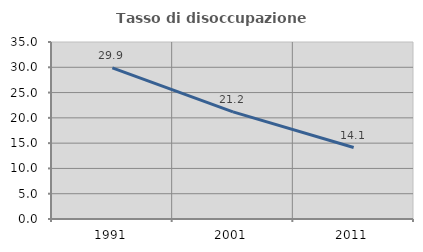
| Category | Tasso di disoccupazione giovanile  |
|---|---|
| 1991.0 | 29.88 |
| 2001.0 | 21.176 |
| 2011.0 | 14.13 |